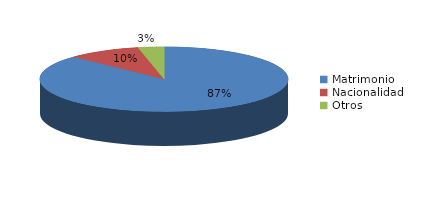
| Category | Series 0 |
|---|---|
| Matrimonio | 310 |
| Nacionalidad | 34 |
| Otros | 12 |